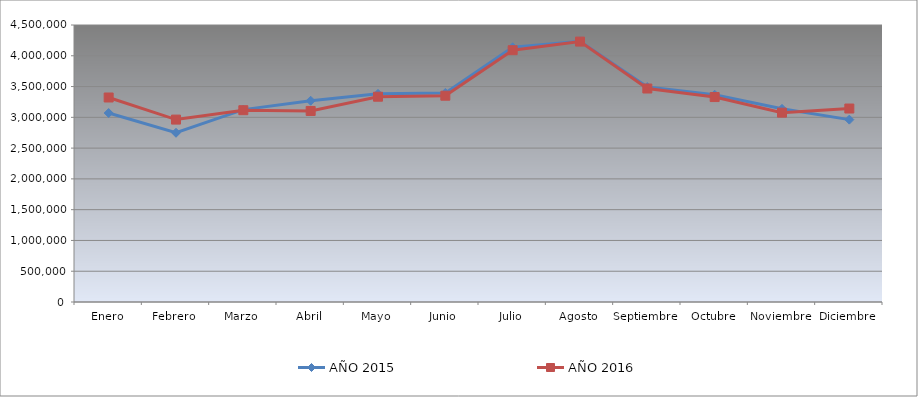
| Category | AÑO 2015 | AÑO 2016 |
|---|---|---|
| Enero | 3070100 | 3322380 |
| Febrero | 2749300 | 2963360 |
| Marzo | 3125580 | 3115940 |
| Abril | 3269520 | 3103480 |
| Mayo | 3381250 | 3335050 |
| Junio | 3395830 | 3351290 |
| Julio | 4138790 | 4090640 |
| Agosto | 4236210 | 4230480 |
| Septiembre | 3491540 | 3468080 |
| Octubre | 3366640 | 3329420 |
| Noviembre | 3138120 | 3075740 |
| Diciembre | 2962580 | 3143080 |